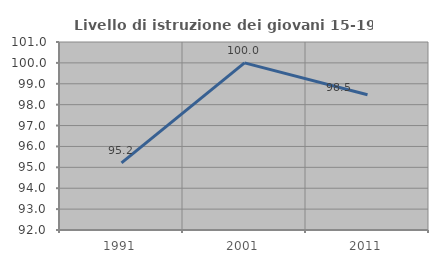
| Category | Livello di istruzione dei giovani 15-19 anni |
|---|---|
| 1991.0 | 95.213 |
| 2001.0 | 100 |
| 2011.0 | 98.473 |